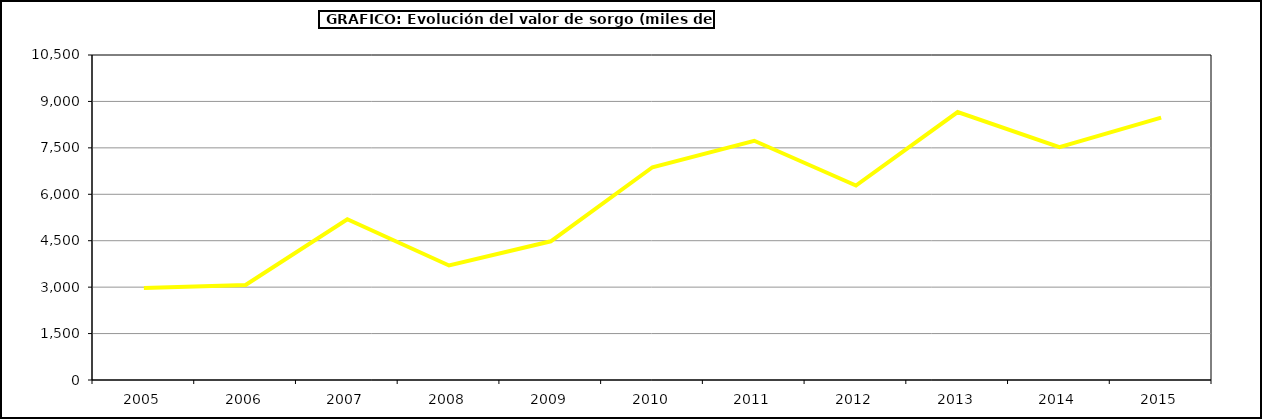
| Category | Producción |
|---|---|
| 2005.0 | 2968.37 |
| 2006.0 | 3071.694 |
| 2007.0 | 5192.201 |
| 2008.0 | 3699.984 |
| 2009.0 | 4481.299 |
| 2010.0 | 6873.468 |
| 2011.0 | 7728.6 |
| 2012.0 | 6283.71 |
| 2013.0 | 8656.32 |
| 2014.0 | 7525 |
| 2015.0 | 8476 |